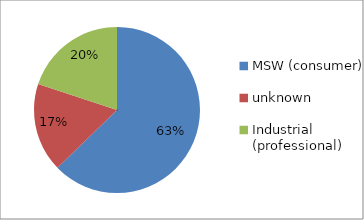
| Category | Series 0 |
|---|---|
| MSW (consumer)  | 0.627 |
| unknown | 0.173 |
| Industrial (professional) | 0.199 |